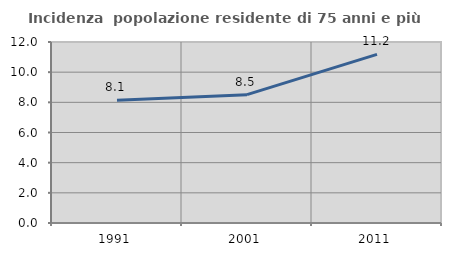
| Category | Incidenza  popolazione residente di 75 anni e più |
|---|---|
| 1991.0 | 8.132 |
| 2001.0 | 8.511 |
| 2011.0 | 11.184 |